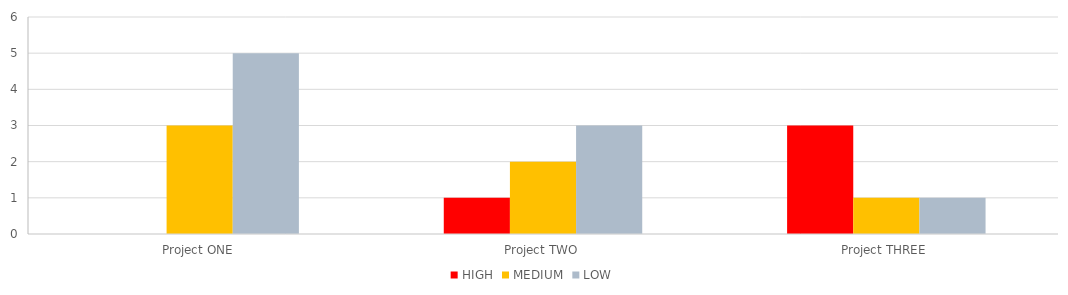
| Category | HIGH | MEDIUM | LOW |
|---|---|---|---|
| Project ONE | 0 | 3 | 5 |
| Project TWO | 1 | 2 | 3 |
| Project THREE | 3 | 1 | 1 |